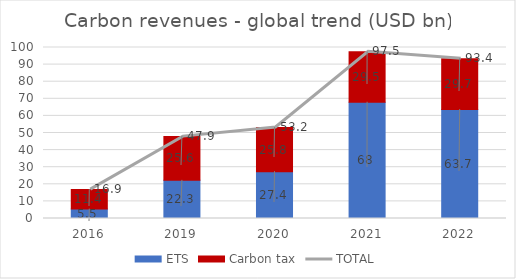
| Category | ETS | Carbon tax |
|---|---|---|
| 2016.0 | 5.5 | 11.4 |
| 2019.0 | 22.3 | 25.6 |
| 2020.0 | 27.4 | 25.8 |
| 2021.0 | 68 | 29.5 |
| 2022.0 | 63.7 | 29.7 |